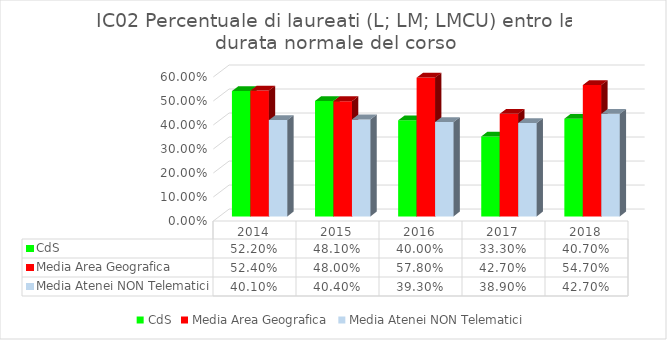
| Category | CdS | Media Area Geografica | Media Atenei NON Telematici |
|---|---|---|---|
| 2014.0 | 0.522 | 0.524 | 0.401 |
| 2015.0 | 0.481 | 0.48 | 0.404 |
| 2016.0 | 0.4 | 0.578 | 0.393 |
| 2017.0 | 0.333 | 0.427 | 0.389 |
| 2018.0 | 0.407 | 0.547 | 0.427 |